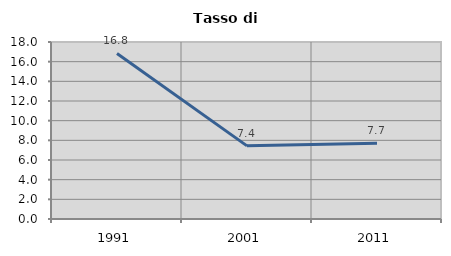
| Category | Tasso di disoccupazione   |
|---|---|
| 1991.0 | 16.837 |
| 2001.0 | 7.437 |
| 2011.0 | 7.713 |